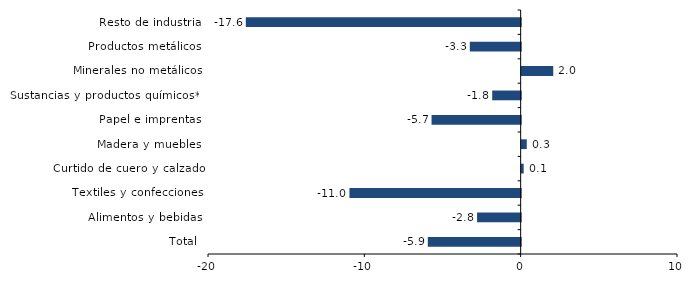
| Category | Series 0 |
|---|---|
| Total | -5.941 |
| Alimentos y bebidas | -2.79 |
| Textiles y confecciones | -10.954 |
| Curtido de cuero y calzado | 0.128 |
| Madera y muebles | 0.327 |
| Papel e imprentas | -5.7 |
| Sustancias y productos químicos** | -1.822 |
| Minerales no metálicos | 2.019 |
| Productos metálicos | -3.254 |
| Resto de industria | -17.583 |